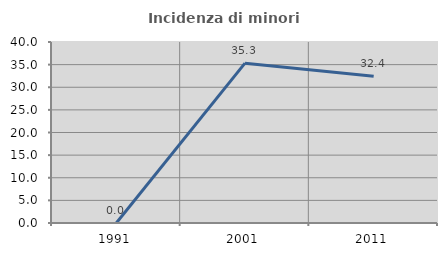
| Category | Incidenza di minori stranieri |
|---|---|
| 1991.0 | 0 |
| 2001.0 | 35.321 |
| 2011.0 | 32.428 |